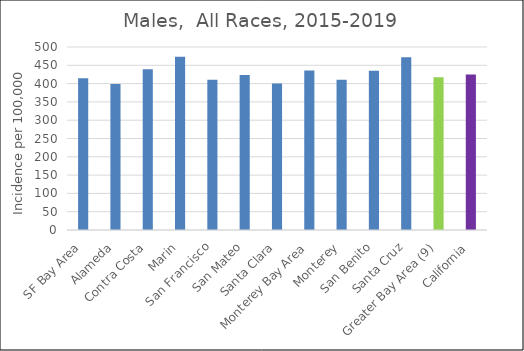
| Category | Male |
|---|---|
| SF Bay Area | 414.94 |
|   Alameda | 399.14 |
|   Contra Costa | 439.37 |
|   Marin | 473.32 |
|   San Francisco | 410.67 |
|   San Mateo | 423.5 |
|   Santa Clara | 400.14 |
| Monterey Bay Area | 435.78 |
|   Monterey | 410.47 |
|   San Benito | 434.97 |
|   Santa Cruz | 472.04 |
| Greater Bay Area (9) | 417.1 |
| California | 424.7 |